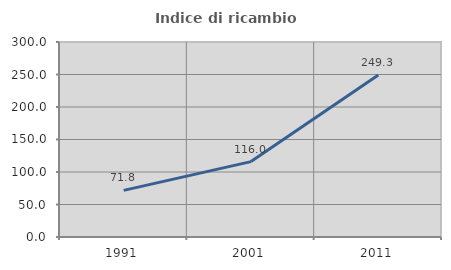
| Category | Indice di ricambio occupazionale  |
|---|---|
| 1991.0 | 71.784 |
| 2001.0 | 115.993 |
| 2011.0 | 249.279 |